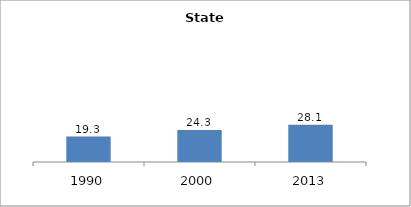
| Category | Series 0 |
|---|---|
| 1990.0 | 19.316 |
| 2000.0 | 24.3 |
| 2013.0 | 28.127 |